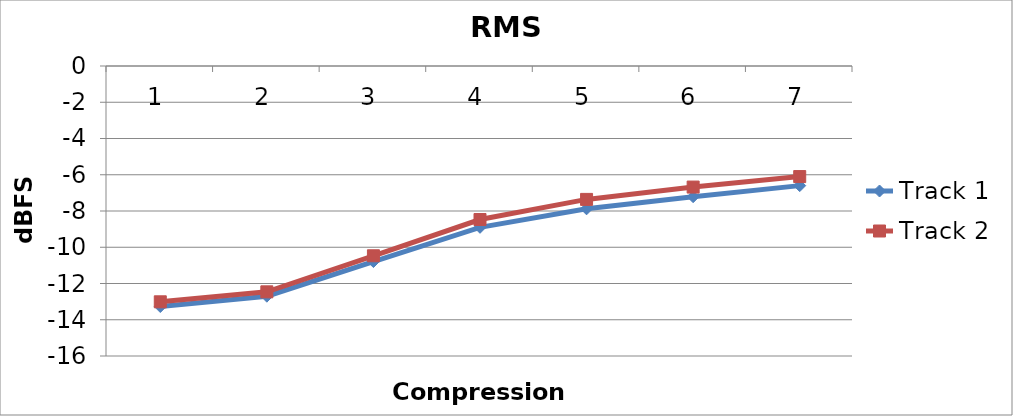
| Category | Track 1 | Track 2 |
|---|---|---|
| 0 | -13.27 | -13.01 |
| 1 | -12.7 | -12.46 |
| 2 | -10.79 | -10.47 |
| 3 | -8.9 | -8.47 |
| 4 | -7.88 | -7.36 |
| 5 | -7.21 | -6.68 |
| 6 | -6.6 | -6.1 |